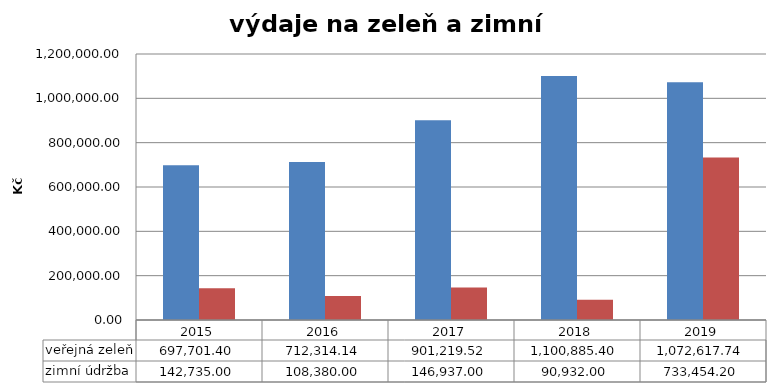
| Category | veřejná zeleň | zimní údržba |
|---|---|---|
| 2015 | 697701.4 | 142735 |
| 2016 | 712314.14 | 108380 |
| 2017 | 901219.52 | 146937 |
| 2018 | 1100885.4 | 90932 |
| 2019 | 1072617.74 | 733454.2 |